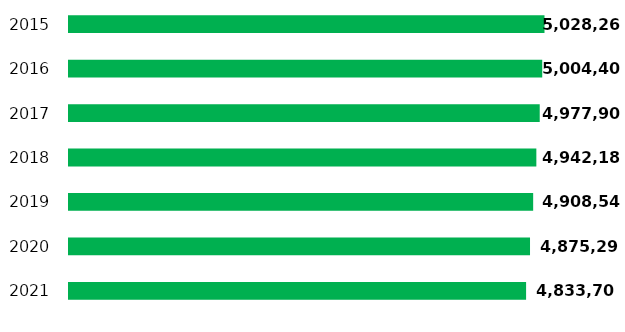
| Category | Anno |
|---|---|
| 2021.0 | 4833705 |
| 2020.0 | 4875290 |
| 2019.0 | 4908548 |
| 2018.0 | 4942188 |
| 2017.0 | 4977900 |
| 2016.0 | 5004400 |
| 2015.0 | 5028266 |